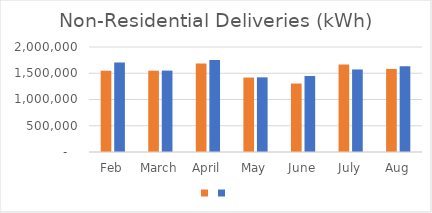
| Category | Series 1 | Series 0 |
|---|---|---|
| Feb | 1548063 | 1705422 |
| March | 1549153 | 1550355 |
| April | 1684677 | 1750598 |
| May | 1417925 | 1421957 |
| June | 1304116 | 1447306 |
| July | 1664865 | 1572197 |
| Aug | 1582276 | 1631031 |